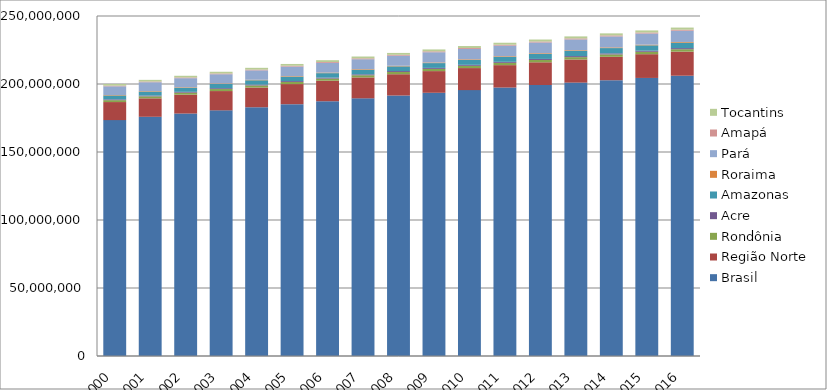
| Category | Brasil | Região Norte | Rondônia | Acre | Amazonas | Roraima | Pará | Amapá | Tocantins |
|---|---|---|---|---|---|---|---|---|---|
| 2000.0 | 173448347 | 13270654 | 1401535 | 587407 | 2872524 | 336829 | 6386876 | 499330 | 1186153 |
| 2001.0 | 175885229 | 13578120 | 1431048 | 602009 | 2946727 | 351178 | 6516683 | 519202 | 1211273 |
| 2002.0 | 178276128 | 13884716 | 1459811 | 616781 | 3021363 | 365275 | 6646479 | 538836 | 1236171 |
| 2003.0 | 180619108 | 14189708 | 1487850 | 631650 | 3096127 | 379035 | 6775865 | 558398 | 1260783 |
| 2004.0 | 182911487 | 14492037 | 1515151 | 646548 | 3170740 | 392392 | 6904392 | 577786 | 1285028 |
| 2005.0 | 185150806 | 14790808 | 1541715 | 661427 | 3244995 | 405273 | 7031660 | 596914 | 1308824 |
| 2006.0 | 187335137 | 15085215 | 1567546 | 676252 | 3318679 | 417634 | 7157305 | 615692 | 1332107 |
| 2007.0 | 189462755 | 15374524 | 1592640 | 690997 | 3391594 | 429406 | 7281011 | 634068 | 1354808 |
| 2008.0 | 191532439 | 15658112 | 1616992 | 705635 | 3463562 | 440533 | 7402515 | 651977 | 1376898 |
| 2009.0 | 193543969 | 15935514 | 1640607 | 720132 | 3534456 | 450969 | 7521656 | 669360 | 1398334 |
| 2010.0 | 195497797 | 16206409 | 1663490 | 734447 | 3604165 | 460678 | 7638340 | 686189 | 1419100 |
| 2011.0 | 197397018 | 16471131 | 1685697 | 748616 | 3672969 | 469943 | 7751993 | 702638 | 1439275 |
| 2012.0 | 199242462 | 16730156 | 1707272 | 762631 | 3740976 | 479073 | 7862333 | 718906 | 1458965 |
| 2013.0 | 201032714 | 16983484 | 1728214 | 776463 | 3807921 | 488072 | 7969654 | 734996 | 1478164 |
| 2014.0 | 202768562 | 17231027 | 1748531 | 790101 | 3873743 | 496936 | 8073924 | 750912 | 1496880 |
| 2015.0 | 204450649 | 17472636 | 1768204 | 803513 | 3938336 | 505665 | 8175113 | 766679 | 1515126 |
| 2016.0 | 206081432 | 17707783 | 1787279 | 816687 | 4001667 | 514229 | 8272724 | 782295 | 1532902 |